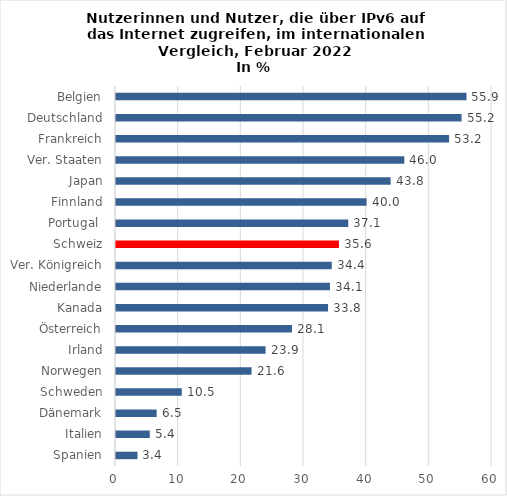
| Category | Series 0 |
|---|---|
| Spanien | 3.43 |
| Italien | 5.39 |
| Dänemark | 6.49 |
| Schweden | 10.5 |
| Norwegen | 21.63 |
| Irland | 23.87 |
| Österreich | 28.08 |
| Kanada | 33.84 |
| Niederlande | 34.14 |
| Ver. Königreich | 34.43 |
| Schweiz | 35.58 |
| Portugal  | 37.06 |
| Finnland | 39.99 |
| Japan | 43.83 |
| Ver. Staaten | 46.01 |
| Frankreich | 53.15 |
| Deutschland | 55.15 |
| Belgien | 55.93 |